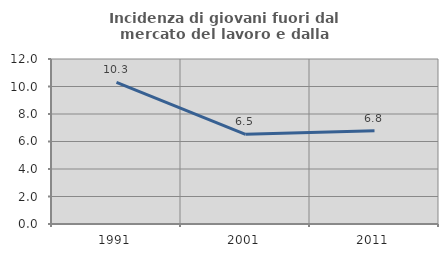
| Category | Incidenza di giovani fuori dal mercato del lavoro e dalla formazione  |
|---|---|
| 1991.0 | 10.294 |
| 2001.0 | 6.522 |
| 2011.0 | 6.78 |